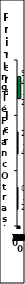
| Category | Series 0 |
|---|---|
| Inglés | 94.2 |
| Francés | 2.4 |
| Otras lenguas | 0.2 |